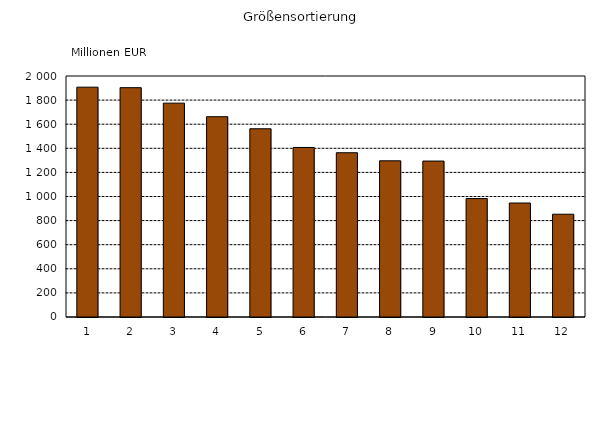
| Category | Series 0 |
|---|---|
| 1 | 1907.32 |
| 2 | 1903.241 |
| 3 | 1774.64 |
| 4 | 1662.251 |
| 5 | 1562.142 |
| 6 | 1406.907 |
| 7 | 1363.133 |
| 8 | 1296.194 |
| 9 | 1294.175 |
| 10 | 982.814 |
| 11 | 945.974 |
| 12 | 852.925 |